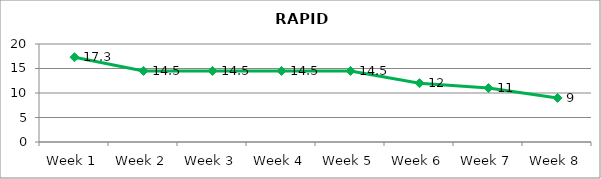
| Category | Score |
|---|---|
| Week 1 | 17.3 |
| Week 2 | 14.5 |
| Week 3 | 14.5 |
| Week 4 | 14.5 |
| Week 5 | 14.5 |
| Week 6 | 12 |
| Week 7 | 11 |
| Week 8 | 9 |